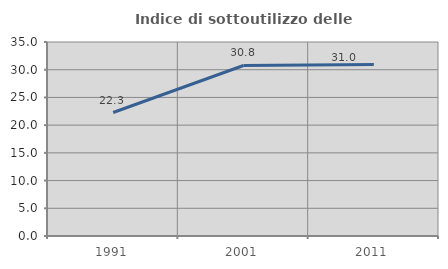
| Category | Indice di sottoutilizzo delle abitazioni  |
|---|---|
| 1991.0 | 22.278 |
| 2001.0 | 30.76 |
| 2011.0 | 30.963 |